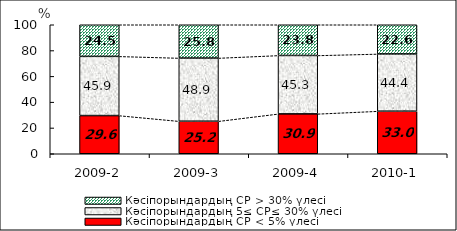
| Category | Кәсіпорындардың СР < 5% үлесі | Кәсіпорындардың 5≤ СР≤ 30% үлесі | Кәсіпорындардың СР > 30% үлесі |
|---|---|---|---|
| 2009-2 | 29.594 | 45.905 | 24.501 |
| 2009-3 | 25.241 | 48.948 | 25.811 |
| 2009-4 | 30.913 | 45.291 | 23.796 |
| 2010-1 | 33.005 | 44.359 | 22.636 |